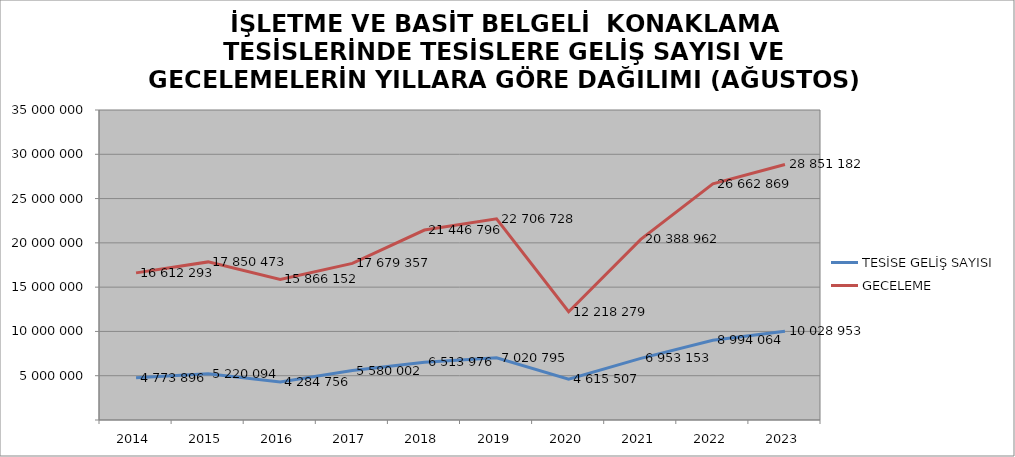
| Category | TESİSE GELİŞ SAYISI | GECELEME |
|---|---|---|
| 2014 | 4773896 | 16612293 |
| 2015 | 5220094 | 17850473 |
| 2016 | 4284756 | 15866152 |
| 2017 | 5580002 | 17679357 |
| 2018 | 6513976 | 21446796 |
| 2019 | 7020795 | 22706728 |
| 2020 | 4615507 | 12218279 |
| 2021 | 6953153 | 20388962 |
| 2022 | 8994064 | 26662869 |
| 2023 | 10028953 | 28851182 |